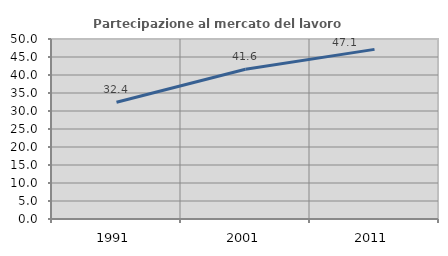
| Category | Partecipazione al mercato del lavoro  femminile |
|---|---|
| 1991.0 | 32.419 |
| 2001.0 | 41.596 |
| 2011.0 | 47.114 |